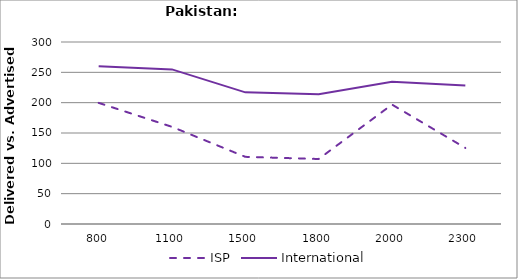
| Category | ISP | International |
|---|---|---|
| 800.0 | 199.667 | 260.167 |
| 1100.0 | 160.143 | 254.857 |
| 1500.0 | 110.7 | 217 |
| 1800.0 | 107.143 | 213.857 |
| 2000.0 | 196.833 | 234.333 |
| 2300.0 | 125.4 | 228.167 |